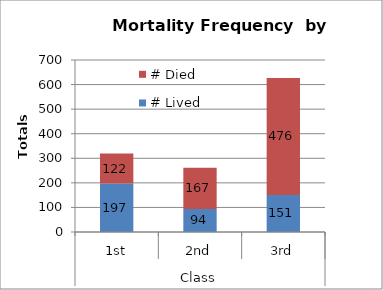
| Category | # Lived | # Died |
|---|---|---|
| 0 | 197 | 122 |
| 1 | 94 | 167 |
| 2 | 151 | 476 |